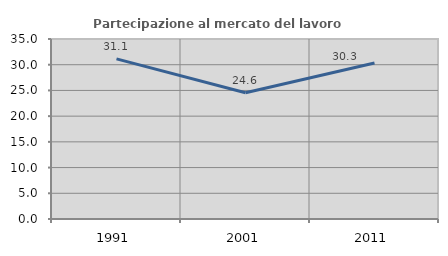
| Category | Partecipazione al mercato del lavoro  femminile |
|---|---|
| 1991.0 | 31.131 |
| 2001.0 | 24.555 |
| 2011.0 | 30.332 |